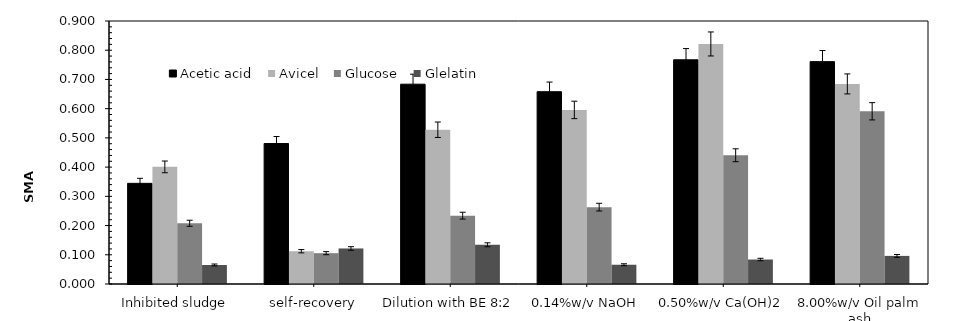
| Category | Acetic acid | Avicel | Glucose | Glelatin |
|---|---|---|---|---|
| Inhibited sludge | 0.344 | 0.401 | 0.208 | 0.065 |
| self-recovery | 0.481 | 0.112 | 0.106 | 0.122 |
| Dilution with BE 8:2 | 0.684 | 0.528 | 0.234 | 0.134 |
| 0.14%w/v NaOH | 0.658 | 0.596 | 0.263 | 0.066 |
| 0.50%w/v Ca(OH)2 | 0.767 | 0.821 | 0.441 | 0.084 |
| 8.00%w/v Oil palm ash | 0.761 | 0.685 | 0.591 | 0.096 |